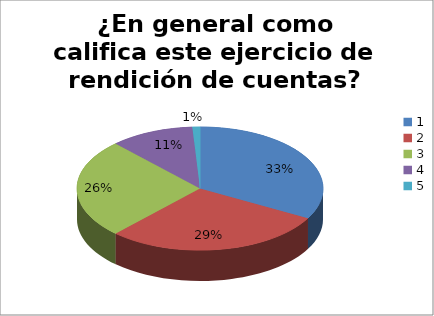
| Category | Series 0 |
|---|---|
| 0 | 33 |
| 1 | 29 |
| 2 | 26 |
| 3 | 11 |
| 4 | 1 |